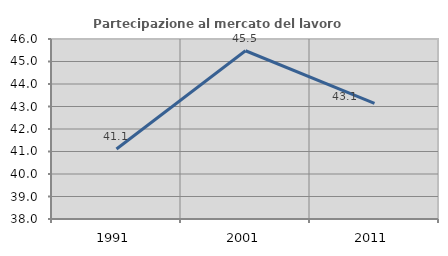
| Category | Partecipazione al mercato del lavoro  femminile |
|---|---|
| 1991.0 | 41.11 |
| 2001.0 | 45.478 |
| 2011.0 | 43.136 |